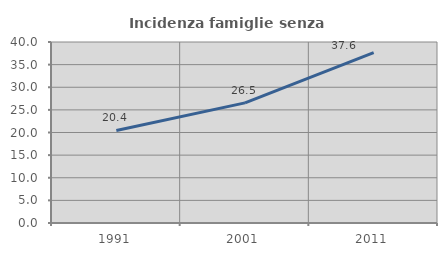
| Category | Incidenza famiglie senza nuclei |
|---|---|
| 1991.0 | 20.448 |
| 2001.0 | 26.542 |
| 2011.0 | 37.64 |